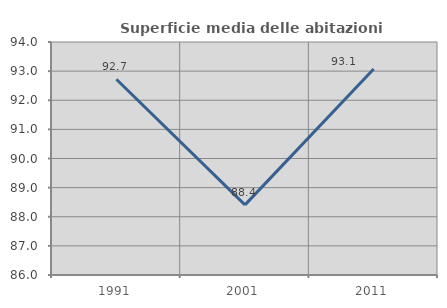
| Category | Superficie media delle abitazioni occupate |
|---|---|
| 1991.0 | 92.72 |
| 2001.0 | 88.408 |
| 2011.0 | 93.071 |